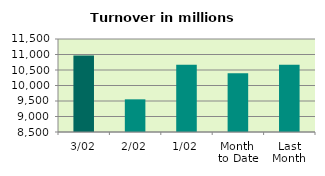
| Category | Series 0 |
|---|---|
| 3/02 | 10968.403 |
| 2/02 | 9553.795 |
| 1/02 | 10670.134 |
| Month 
to Date | 10397.444 |
| Last
Month | 10672.471 |